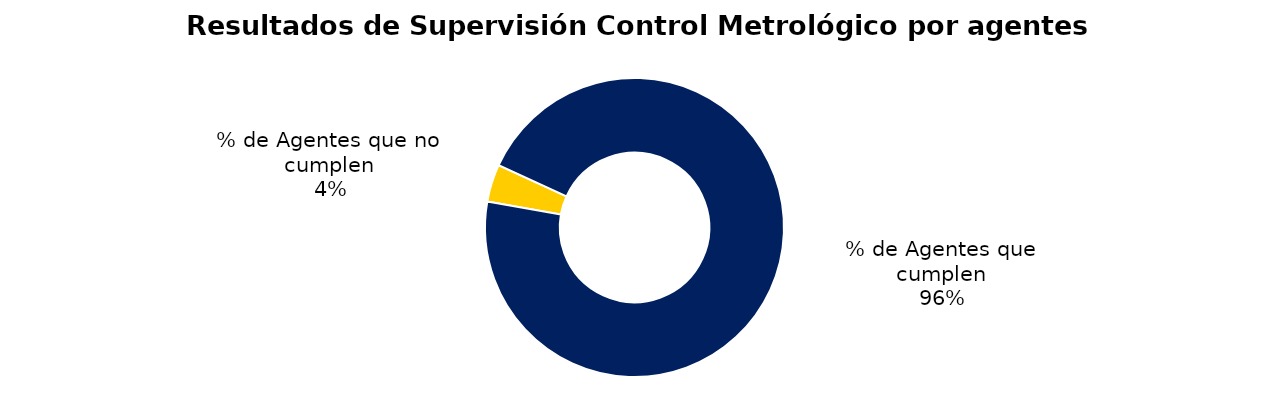
| Category | Series 0 |
|---|---|
| % de Agentes que no cumplen | 19 |
| % de Agentes que cumplen | 448 |